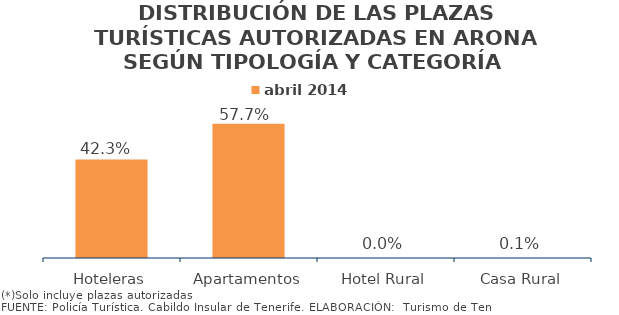
| Category | abril 2014 |
|---|---|
| Hoteleras | 0.423 |
| Apartamentos | 0.577 |
| Hotel Rural | 0 |
| Casa Rural | 0.001 |